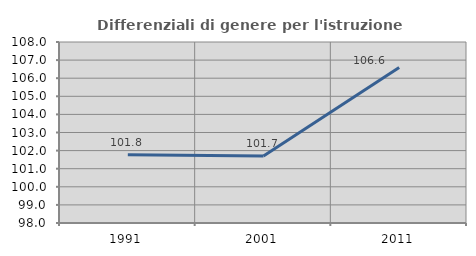
| Category | Differenziali di genere per l'istruzione superiore |
|---|---|
| 1991.0 | 101.771 |
| 2001.0 | 101.701 |
| 2011.0 | 106.597 |